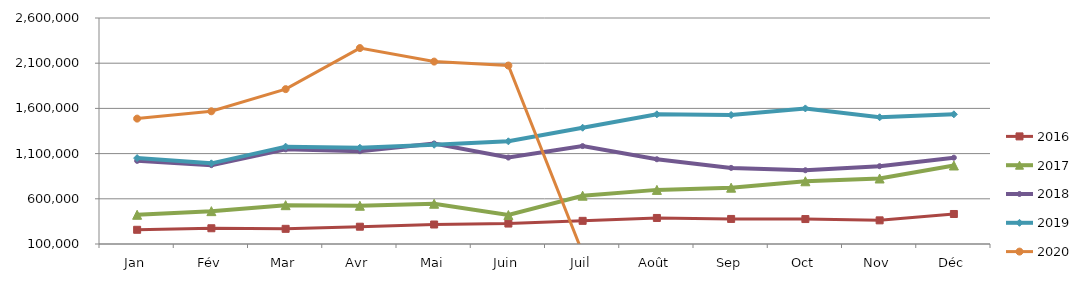
| Category | 2015 | 2016 | 2017 | 2018 | 2019 | 2020 |
|---|---|---|---|---|---|---|
| Jan |  | 257238.227 | 423360.679 | 1019658.015 | 1050220.805 | 1487095.506 |
| Fév |  | 274182.928 | 463512.001 | 972274.256 | 992184.961 | 1568141.915 |
| Mar |  | 267739.55 | 529345.368 | 1147166.528 | 1176757.88 | 1813146.21 |
| Avr |  | 291238.37 | 523228.337 | 1126714.531 | 1164825.987 | 2267448.511 |
| Mai |  | 315573.949 | 545414.731 | 1212070.878 | 1197851.486 | 2117791.111 |
| Juin |  | 326203.362 | 420430.116 | 1056092.947 | 1235809.908 | 2073858.56 |
| Juil |  | 356111.54 | 634345.533 | 1183060.966 | 1386180.582 | 0 |
| Août |  | 388007.58 | 698691.374 | 1037606.311 | 1534426.4 | 0 |
| Sep |  | 377114.56 | 722782.357 | 941820.554 | 1527323.009 | 0 |
| Oct |  | 376009.188 | 793837.955 | 915772.772 | 1599889.902 | 0 |
| Nov |  | 361587.784 | 824574.744 | 960817.552 | 1501599.407 | 0 |
| Déc |  | 431907.412 | 968412.649 | 1054685.303 | 1534756.751 | 0 |